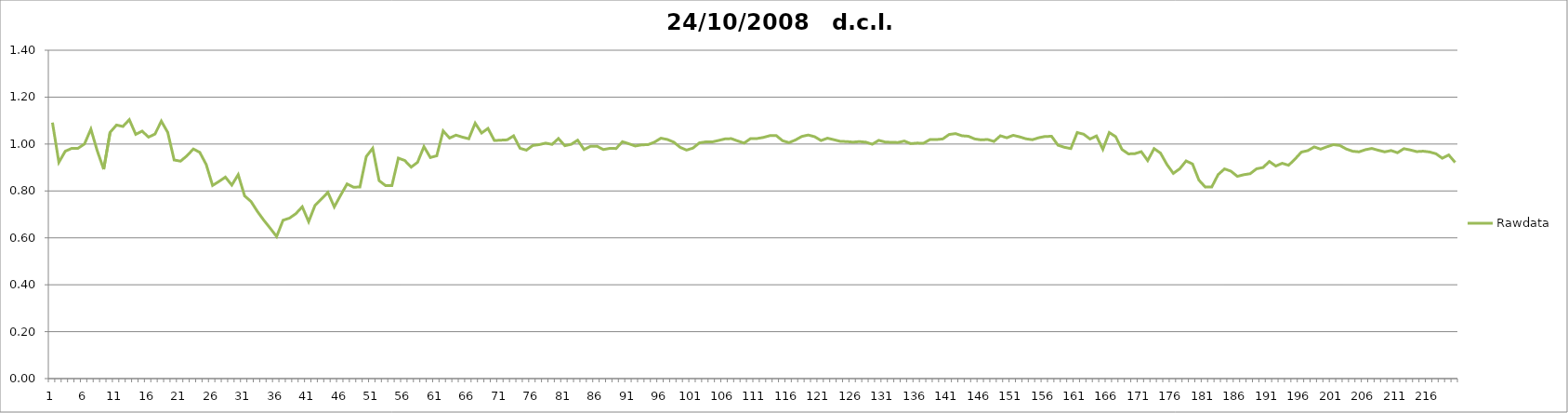
| Category | Rawdata |
|---|---|
| 0 | 1.092 |
| 1 | 0.922 |
| 2 | 0.97 |
| 3 | 0.982 |
| 4 | 0.982 |
| 5 | 1 |
| 6 | 1.064 |
| 7 | 0.971 |
| 8 | 0.893 |
| 9 | 1.05 |
| 10 | 1.081 |
| 11 | 1.075 |
| 12 | 1.104 |
| 13 | 1.041 |
| 14 | 1.055 |
| 15 | 1.029 |
| 16 | 1.042 |
| 17 | 1.098 |
| 18 | 1.049 |
| 19 | 0.932 |
| 20 | 0.927 |
| 21 | 0.95 |
| 22 | 0.979 |
| 23 | 0.964 |
| 24 | 0.913 |
| 25 | 0.824 |
| 26 | 0.841 |
| 27 | 0.859 |
| 28 | 0.825 |
| 29 | 0.87 |
| 30 | 0.779 |
| 31 | 0.755 |
| 32 | 0.713 |
| 33 | 0.675 |
| 34 | 0.641 |
| 35 | 0.606 |
| 36 | 0.675 |
| 37 | 0.684 |
| 38 | 0.703 |
| 39 | 0.733 |
| 40 | 0.669 |
| 41 | 0.739 |
| 42 | 0.766 |
| 43 | 0.794 |
| 44 | 0.732 |
| 45 | 0.782 |
| 46 | 0.83 |
| 47 | 0.816 |
| 48 | 0.817 |
| 49 | 0.947 |
| 50 | 0.982 |
| 51 | 0.844 |
| 52 | 0.823 |
| 53 | 0.823 |
| 54 | 0.94 |
| 55 | 0.93 |
| 56 | 0.902 |
| 57 | 0.922 |
| 58 | 0.989 |
| 59 | 0.943 |
| 60 | 0.95 |
| 61 | 1.056 |
| 62 | 1.025 |
| 63 | 1.038 |
| 64 | 1.029 |
| 65 | 1.023 |
| 66 | 1.089 |
| 67 | 1.047 |
| 68 | 1.066 |
| 69 | 1.015 |
| 70 | 1.016 |
| 71 | 1.018 |
| 72 | 1.035 |
| 73 | 0.982 |
| 74 | 0.974 |
| 75 | 0.994 |
| 76 | 0.997 |
| 77 | 1.004 |
| 78 | 0.998 |
| 79 | 1.024 |
| 80 | 0.993 |
| 81 | 0.999 |
| 82 | 1.016 |
| 83 | 0.976 |
| 84 | 0.991 |
| 85 | 0.991 |
| 86 | 0.976 |
| 87 | 0.981 |
| 88 | 0.981 |
| 89 | 1.01 |
| 90 | 1.001 |
| 91 | 0.992 |
| 92 | 0.996 |
| 93 | 0.997 |
| 94 | 1.008 |
| 95 | 1.025 |
| 96 | 1.02 |
| 97 | 1.008 |
| 98 | 0.986 |
| 99 | 0.974 |
| 100 | 0.983 |
| 101 | 1.005 |
| 102 | 1.009 |
| 103 | 1.009 |
| 104 | 1.015 |
| 105 | 1.022 |
| 106 | 1.023 |
| 107 | 1.013 |
| 108 | 1.004 |
| 109 | 1.024 |
| 110 | 1.024 |
| 111 | 1.028 |
| 112 | 1.036 |
| 113 | 1.036 |
| 114 | 1.014 |
| 115 | 1.006 |
| 116 | 1.017 |
| 117 | 1.032 |
| 118 | 1.038 |
| 119 | 1.031 |
| 120 | 1.015 |
| 121 | 1.025 |
| 122 | 1.019 |
| 123 | 1.012 |
| 124 | 1.01 |
| 125 | 1.008 |
| 126 | 1.01 |
| 127 | 1.008 |
| 128 | 0.999 |
| 129 | 1.016 |
| 130 | 1.009 |
| 131 | 1.007 |
| 132 | 1.007 |
| 133 | 1.013 |
| 134 | 1.002 |
| 135 | 1.004 |
| 136 | 1.004 |
| 137 | 1.019 |
| 138 | 1.019 |
| 139 | 1.022 |
| 140 | 1.041 |
| 141 | 1.044 |
| 142 | 1.035 |
| 143 | 1.033 |
| 144 | 1.022 |
| 145 | 1.018 |
| 146 | 1.02 |
| 147 | 1.011 |
| 148 | 1.035 |
| 149 | 1.027 |
| 150 | 1.037 |
| 151 | 1.031 |
| 152 | 1.022 |
| 153 | 1.018 |
| 154 | 1.027 |
| 155 | 1.032 |
| 156 | 1.033 |
| 157 | 0.995 |
| 158 | 0.986 |
| 159 | 0.981 |
| 160 | 1.049 |
| 161 | 1.042 |
| 162 | 1.022 |
| 163 | 1.035 |
| 164 | 0.978 |
| 165 | 1.049 |
| 166 | 1.032 |
| 167 | 0.976 |
| 168 | 0.958 |
| 169 | 0.959 |
| 170 | 0.968 |
| 171 | 0.93 |
| 172 | 0.98 |
| 173 | 0.962 |
| 174 | 0.913 |
| 175 | 0.875 |
| 176 | 0.895 |
| 177 | 0.928 |
| 178 | 0.915 |
| 179 | 0.846 |
| 180 | 0.817 |
| 181 | 0.817 |
| 182 | 0.87 |
| 183 | 0.894 |
| 184 | 0.884 |
| 185 | 0.862 |
| 186 | 0.869 |
| 187 | 0.874 |
| 188 | 0.895 |
| 189 | 0.9 |
| 190 | 0.926 |
| 191 | 0.906 |
| 192 | 0.918 |
| 193 | 0.91 |
| 194 | 0.936 |
| 195 | 0.966 |
| 196 | 0.972 |
| 197 | 0.988 |
| 198 | 0.978 |
| 199 | 0.988 |
| 200 | 0.998 |
| 201 | 0.994 |
| 202 | 0.979 |
| 203 | 0.969 |
| 204 | 0.967 |
| 205 | 0.976 |
| 206 | 0.981 |
| 207 | 0.974 |
| 208 | 0.967 |
| 209 | 0.972 |
| 210 | 0.963 |
| 211 | 0.98 |
| 212 | 0.975 |
| 213 | 0.968 |
| 214 | 0.969 |
| 215 | 0.966 |
| 216 | 0.959 |
| 217 | 0.94 |
| 218 | 0.954 |
| 219 | 0.922 |